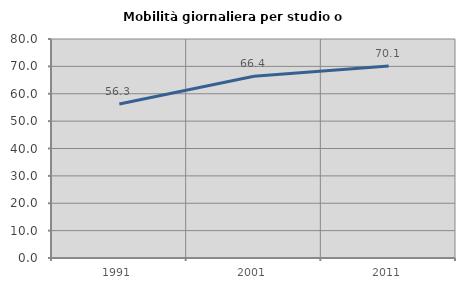
| Category | Mobilità giornaliera per studio o lavoro |
|---|---|
| 1991.0 | 56.26 |
| 2001.0 | 66.381 |
| 2011.0 | 70.112 |